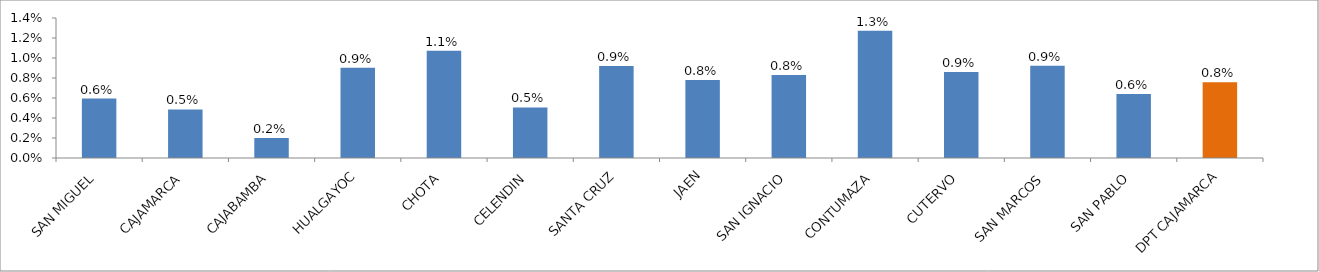
| Category | Series 0 |
|---|---|
| SAN MIGUEL | 0.006 |
| CAJAMARCA | 0.005 |
| CAJABAMBA | 0.002 |
| HUALGAYOC | 0.009 |
| CHOTA | 0.011 |
| CELENDIN | 0.005 |
| SANTA CRUZ | 0.009 |
| JAEN | 0.008 |
| SAN IGNACIO | 0.008 |
| CONTUMAZA | 0.013 |
| CUTERVO | 0.009 |
| SAN MARCOS | 0.009 |
| SAN PABLO | 0.006 |
| DPT CAJAMARCA | 0.008 |